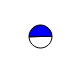
| Category | Series 0 |
|---|---|
| 0 | 4200820 |
| 1 | 4277061 |